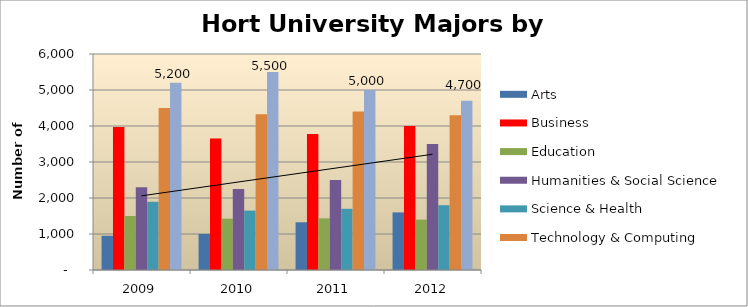
| Category | Arts | Business | Education | Humanities & Social Science | Science & Health | Technology & Computing | Undeclared |
|---|---|---|---|---|---|---|---|
| 2009.0 | 950 | 3975 | 1500 | 2300 | 1895 | 4500 | 5200 |
| 2010.0 | 1000 | 3650 | 1425 | 2250 | 1650 | 4325 | 5500 |
| 2011.0 | 1325 | 3775 | 1435 | 2500 | 1700 | 4400 | 5000 |
| 2012.0 | 1600 | 4000 | 1400 | 3500 | 1800 | 4300 | 4700 |